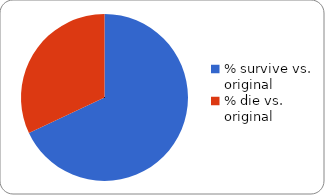
| Category | Series 1 | Series 0 |
|---|---|---|
| % survive vs. original | 0.68 | 0.34 |
| % die vs. original | 0.32 | 0.66 |